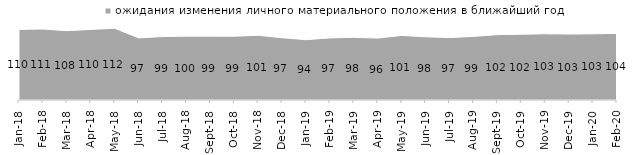
| Category | ожидания изменения личного материального положения в ближайший год |
|---|---|
| 2018-01-01 | 110.05 |
| 2018-02-01 | 110.65 |
| 2018-03-01 | 108 |
| 2018-04-01 | 109.95 |
| 2018-05-01 | 111.8 |
| 2018-06-01 | 96.75 |
| 2018-07-01 | 98.85 |
| 2018-08-01 | 99.5 |
| 2018-09-01 | 99.45 |
| 2018-10-01 | 99.4 |
| 2018-11-01 | 100.848 |
| 2018-12-01 | 97.05 |
| 2019-01-01 | 94.05 |
| 2019-02-01 | 96.75 |
| 2019-03-01 | 97.663 |
| 2019-04-01 | 96.436 |
| 2019-05-01 | 100.693 |
| 2019-06-01 | 98.404 |
| 2019-07-01 | 97.228 |
| 2019-08-01 | 99.151 |
| 2019-09-01 | 101.881 |
| 2019-10-01 | 102.475 |
| 2019-11-01 | 103.218 |
| 2019-12-01 | 102.772 |
| 2020-01-01 | 103.119 |
| 2020-02-01 | 103.861 |